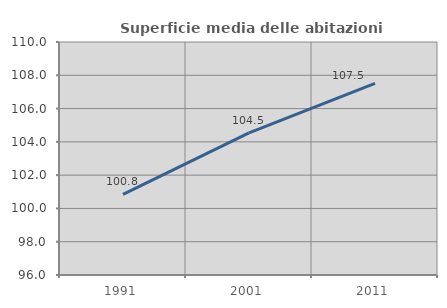
| Category | Superficie media delle abitazioni occupate |
|---|---|
| 1991.0 | 100.846 |
| 2001.0 | 104.545 |
| 2011.0 | 107.508 |